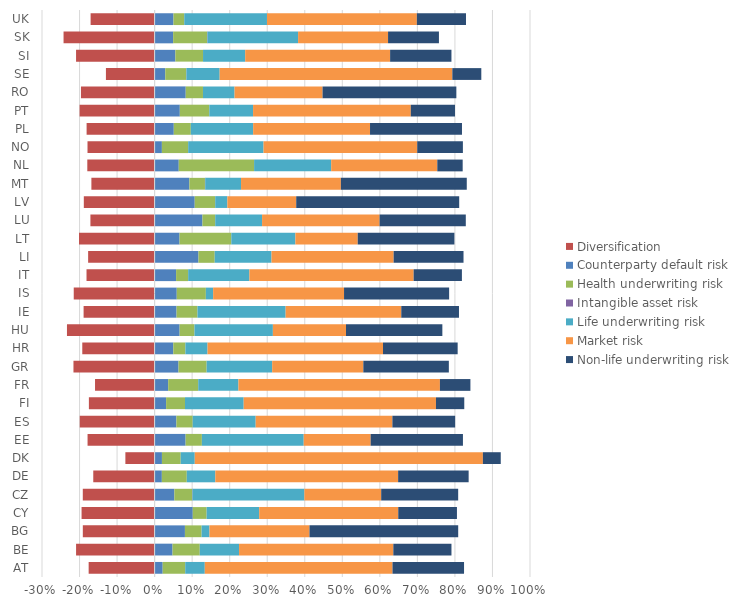
| Category | Diversification | Counterparty default risk | Health underwriting risk | Intangible asset risk | Life underwriting risk | Market risk | Non-life underwriting risk |
|---|---|---|---|---|---|---|---|
| AT | -2328398947 | 285095039.21 | 795693651.35 | 0 | 690474698.35 | 6626556098.5 | 2525499266.4 |
| BE | -4378061822 | 998862024.48 | 1517672153.1 | 628075.51 | 2189292055 | 8599815787.3 | 3240480736.6 |
| BG | -375204995.4 | 158433282.04 | 87098397.91 | 1008 | 41302993.45 | 522537523.83 | 777126781.73 |
| CY | -204646162 | 106878517.95 | 38832460.8 | 9931 | 147204638.57 | 389568118.85 | 164452814.36 |
| CZ | -10097340439 | 2775938036.8 | 2502558609.1 | 44507530.56 | 15732518314 | 10798071704 | 10823844837 |
| DE | -19474371296 | 2298788731.2 | 7913598855.4 | 25363.14 | 9053631600.7 | 58033553266 | 22384623475 |
| DK | -5896435554 | 1477114493.2 | 3783060092.1 | 8105564 | 2827894886.4 | 58100680008 | 3604771210.9 |
| EE | -83250038.03 | 38493278 | 20179761.56 | 0 | 126453223.83 | 83092660.13 | 114572066.57 |
| ES | -8324168738 | 2423623932.7 | 1812335258.4 | 286412.64 | 7003772394.5 | 15202779127 | 6978642520.4 |
| FI | -1891204902 | 330932347.27 | 543199443.57 | 0 | 1688937080.5 | 5532461936.4 | 814682985.58 |
| FR | -37195003299 | 8476180583.8 | 18727681854 | 9399305.8 | 25106391008 | 125766175472 | 19036746263 |
| GR | -704040105.3 | 207392145.32 | 243807110.67 | 232442.32 | 568408039.75 | 790847215.76 | 741876318.52 |
| HR | -1731944371 | 447149418.23 | 289667440.42 | 0 | 530494774.99 | 4200978944 | 1787486697.4 |
| HU | -95879089508 | 27369532946 | 16222931018 | 0 | 85782974487 | 79983016034 | 105400041692 |
| IE | -5603684030 | 1731836193.3 | 1650068287.3 | 36535.58 | 6956754311.3 | 9124661673.2 | 4553424795.8 |
| IS | -14104653292 | 3863441762.2 | 5074764123.6 | 0 | 1268257078.3 | 22830377863 | 18327382697 |
| IT | -5575612192 | 1759224319.3 | 987552304.73 | 0 | 5014791381.2 | 13448802707 | 3951231105.9 |
| LI | -453260907.4 | 299072817.12 | 110620207.04 | 9249.7 | 387316176.79 | 832588985.26 | 476394493.96 |
| LT | -62986038.29 | 20779389.02 | 43104501.29 | 0 | 53386279.7 | 51931264.08 | 80531886.02 |
| LU | -3178659003 | 2368365298.4 | 632295150.81 | 0 | 2319677658.7 | 5818303140.3 | 4268272251.6 |
| LV | -33250388.47 | 18839663.47 | 9618174.93 | 0 | 5706181.13 | 32339556.93 | 76548808.13 |
| MT | -302106634.3 | 166222323.88 | 74249600.7 | 1256259 | 171164345.05 | 477111343 | 601546818.37 |
| NL | -6598796526 | 2366772532.5 | 7385586730.9 | -550977 | 7556173961.3 | 10402510197 | 2488738812.3 |
| NO | -30947534919 | 3355300617.4 | 12097321172 | 25340421.8 | 34750950339 | 70885791201 | 21053607139 |
| PL | -7673760880 | 2163663085.3 | 1919727744.8 | 0 | 7033405668.3 | 13187689533 | 10376107067 |
| PT | -1300408134 | 437031394.35 | 511574131.15 | 0 | 758406256.5 | 2734878994.6 | 766366716.2 |
| RO | -686642665.9 | 290158521.69 | 160663649.13 | 0 | 294477185.87 | 820543448.08 | 1247375645.7 |
| SE | -45912939578 | 10071071653 | 19744812480 | 119607808.83 | 31415763625 | 219385985216 | 27321679704 |
| SI | -606697615.3 | 160344062.67 | 213579854.89 | 0 | 325592472.56 | 1119267635.2 | 473620412.85 |
| SK | -259196373.4 | 52742764.62 | 96364562.64 | 1190055 | 258095926.6 | 256065805.92 | 144819111.76 |
| UK | -11409846163 | 3364080897.5 | 1919602970.8 | 718128 | 14746984187 | 26718775242 | 8760483053.1 |